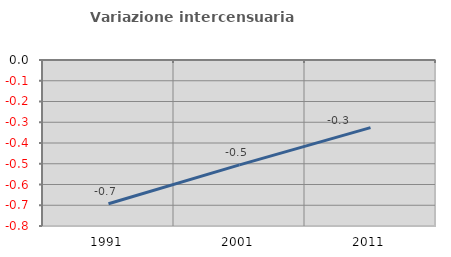
| Category | Variazione intercensuaria annua |
|---|---|
| 1991.0 | -0.693 |
| 2001.0 | -0.506 |
| 2011.0 | -0.326 |